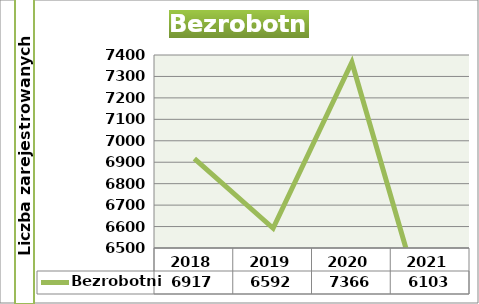
| Category | Bezrobotni |
|---|---|
| 2018.0 | 6917 |
| 2019.0 | 6592 |
| 2020.0 | 7366 |
| 2021.0 | 6103 |